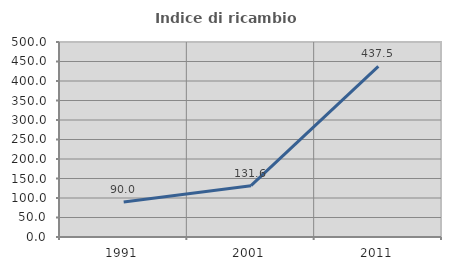
| Category | Indice di ricambio occupazionale  |
|---|---|
| 1991.0 | 90 |
| 2001.0 | 131.579 |
| 2011.0 | 437.5 |